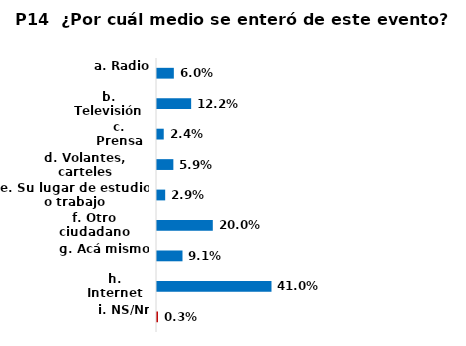
| Category | Series 0 |
|---|---|
| a. Radio | 0.06 |
| b. Televisión | 0.122 |
| c. Prensa | 0.024 |
| d. Volantes, carteles | 0.059 |
| e. Su lugar de estudio o trabajo | 0.029 |
| f. Otro ciudadano | 0.2 |
| g. Acá mismo  | 0.091 |
| h. Internet | 0.41 |
| i. NS/Nr | 0.003 |